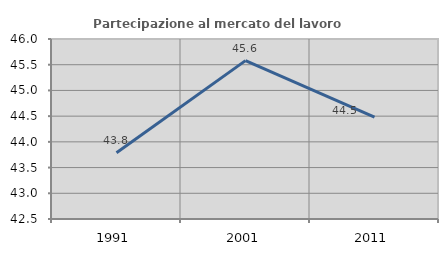
| Category | Partecipazione al mercato del lavoro  femminile |
|---|---|
| 1991.0 | 43.789 |
| 2001.0 | 45.58 |
| 2011.0 | 44.481 |